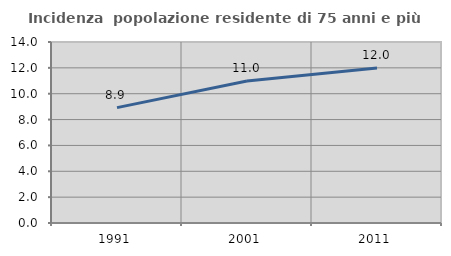
| Category | Incidenza  popolazione residente di 75 anni e più |
|---|---|
| 1991.0 | 8.926 |
| 2001.0 | 10.982 |
| 2011.0 | 11.981 |